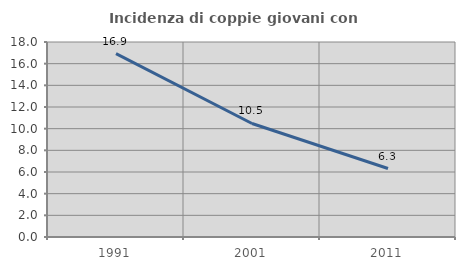
| Category | Incidenza di coppie giovani con figli |
|---|---|
| 1991.0 | 16.932 |
| 2001.0 | 10.481 |
| 2011.0 | 6.322 |